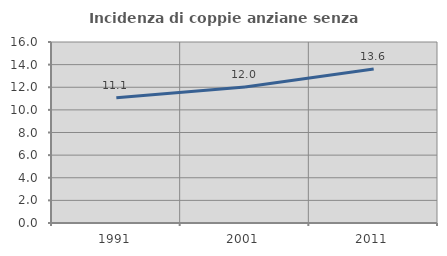
| Category | Incidenza di coppie anziane senza figli  |
|---|---|
| 1991.0 | 11.078 |
| 2001.0 | 12.022 |
| 2011.0 | 13.614 |